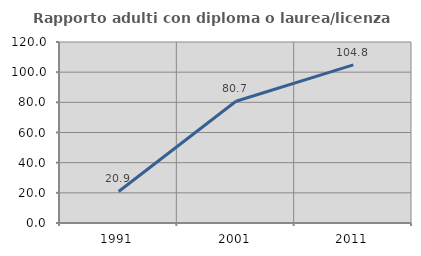
| Category | Rapporto adulti con diploma o laurea/licenza media  |
|---|---|
| 1991.0 | 20.896 |
| 2001.0 | 80.702 |
| 2011.0 | 104.839 |